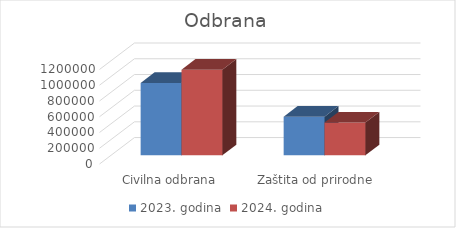
| Category | 2023. godina | 2024. godina |
|---|---|---|
| Civilna odbrana | 918286 | 1086310 |
| Zaštita od prirodne nepogode | 490000 | 416700 |